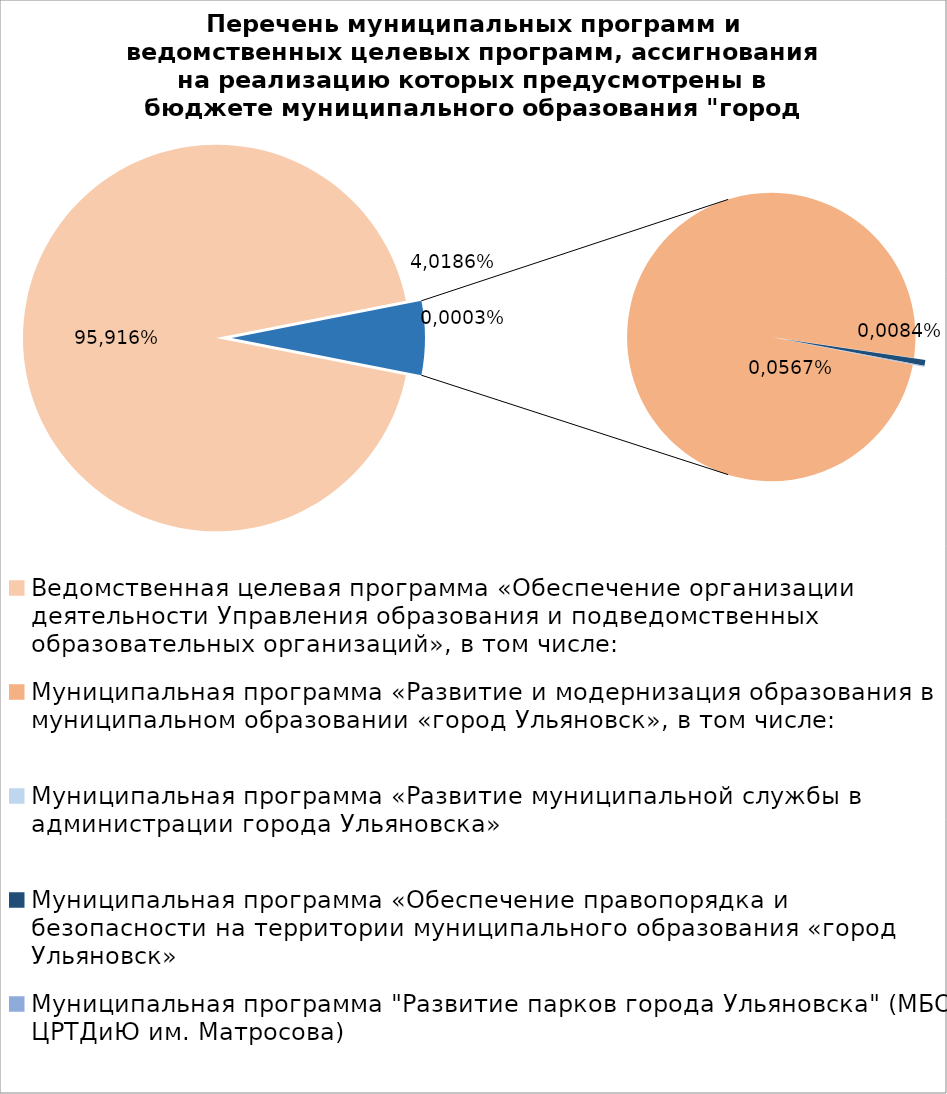
| Category | Series 0 |
|---|---|
| Ведомственная целевая программа «Обеспечение организации деятельности Управления образования и подведомственных образовательных организаций», в том числе: | 6167640.43 |
| Муниципальная программа «Развитие и модернизация образования в муниципальном образовании «город Ульяновск», в том числе: | 402061.74 |
| Муниципальная программа «Развитие муниципальной службы в администрации города Ульяновска» | 15.4 |
| Муниципальная программа «Обеспечение правопорядка и безопасности на территории муниципального образования «город Ульяновск» | 2700 |
| Муниципальная программа "Развитие парков города Ульяновска" (МБОУ ЦРТДиЮ им. Матросова) | 400 |